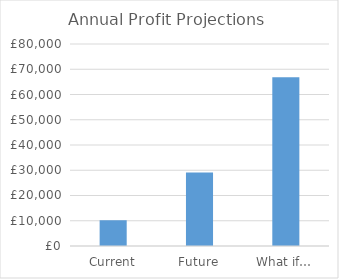
| Category | Series 0 |
|---|---|
| Current | 10200 |
| Future | 29132.22 |
| What if… | 66846.72 |